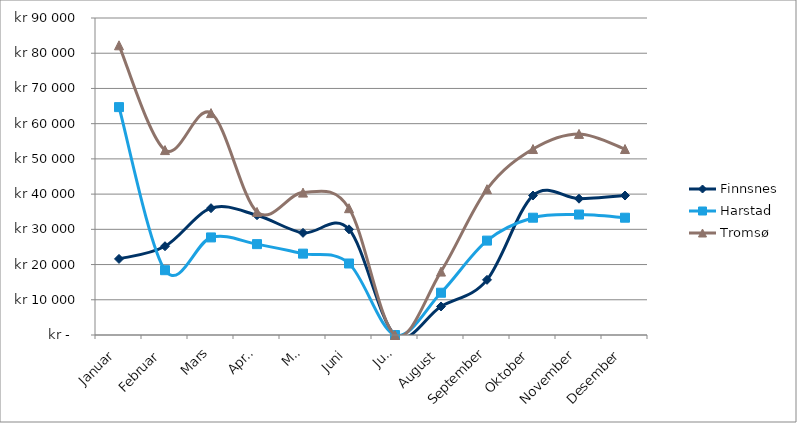
| Category | Finnsnes | Harstad | Tromsø |
|---|---|---|---|
| Januar | 21600 | 64700 | 82250 |
| Februar | 25200 | 18400 | 52500 |
| Mars | 36000 | 27700 | 63000 |
| April | 34000 | 25800 | 34950 |
| Mai | 29000 | 23100 | 40425 |
| Juni | 30000 | 20300 | 36000 |
| Juli | 0 | 0 | 0 |
| August | 8100 | 12000 | 18000 |
| September | 15660 | 26800 | 41400 |
| Oktober | 39600 | 33300 | 52800 |
| November | 38700 | 34200 | 57100 |
| Desember | 39600 | 33300 | 52800 |